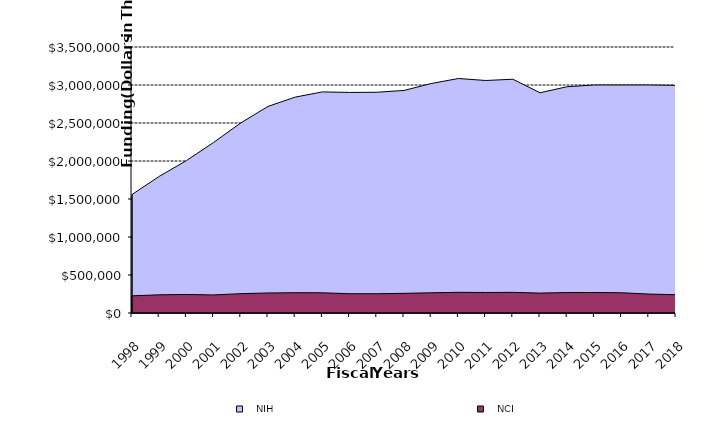
| Category |    NIH |    NCI |
|---|---|---|
| 1998.0 | 1559071 | 225991 |
| 1999.0 | 1797422 | 239190 |
| 2000.0 | 2005100 | 244145 |
| 2001.0 | 2244160 | 237789 |
| 2002.0 | 2500866 | 254396 |
| 2003.0 | 2718171 | 263442 |
| 2004.0 | 2840384 | 266975 |
| 2005.0 | 2909381 | 265907 |
| 2006.0 | 2902183 | 253666 |
| 2007.0 | 2904536 | 253666 |
| 2008.0 | 2928300 | 258499 |
| 2009.0 | 3019279 | 265882 |
| 2010.0 | 3085597 | 272130 |
| 2011.0 | 3059243 | 269953 |
| 2012.0 | 3076056 | 271692 |
| 2013.0 | 2897865 | 261550 |
| 2014.0 | 2977579 | 269212 |
| 2015.0 | 3000061 | 269660 |
| 2016.0 | 3000061 | 266422 |
| 2017.0 | 3000061 | 249019 |
| 2018.0 | 2995381 | 241234 |